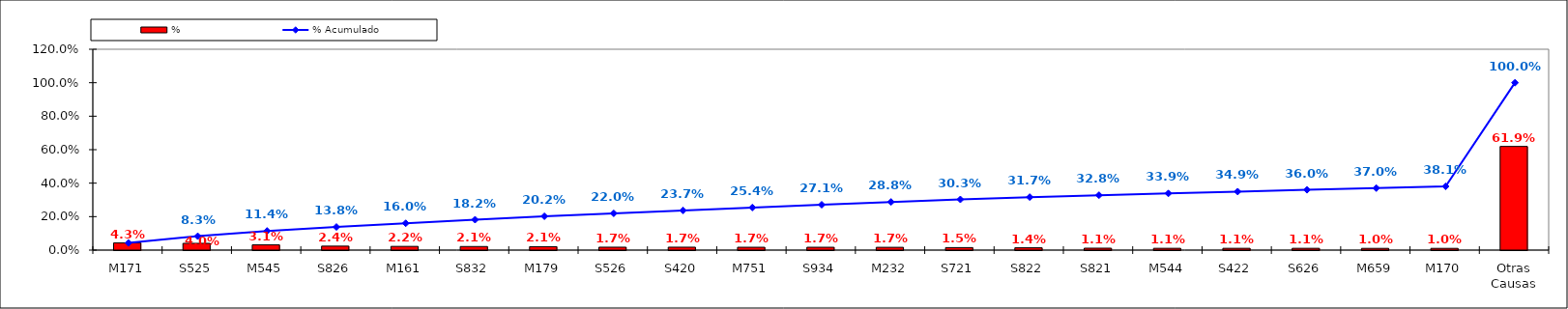
| Category | % |
|---|---|
| M171 | 0.043 |
| S525 | 0.04 |
| M545 | 0.031 |
| S826 | 0.024 |
| M161 | 0.022 |
| S832 | 0.021 |
| M179 | 0.021 |
| S526 | 0.017 |
| S420 | 0.017 |
| M751 | 0.017 |
| S934 | 0.017 |
| M232 | 0.017 |
| S721 | 0.015 |
| S822 | 0.014 |
| S821 | 0.011 |
| M544 | 0.011 |
| S422 | 0.011 |
| S626 | 0.011 |
| M659 | 0.01 |
| M170 | 0.01 |
| Otras Causas | 0.619 |